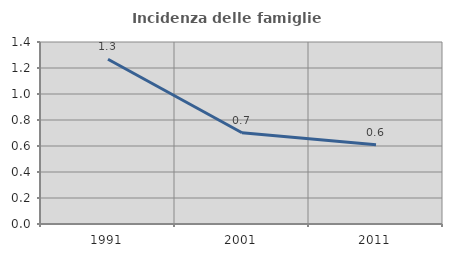
| Category | Incidenza delle famiglie numerose |
|---|---|
| 1991.0 | 1.267 |
| 2001.0 | 0.702 |
| 2011.0 | 0.609 |